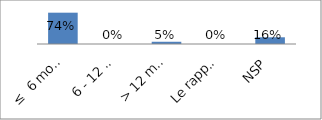
| Category | Series 0 |
|---|---|
| ≤  6 mois après la fin de l'année budgétaire | 0.737 |
| 6 - 12 mois | 0 |
| > 12 mois | 0.053 |
| Le rapport n'est pas publié | 0 |
| NSP | 0.158 |